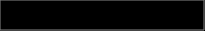
| Category | Series 0 |
|---|---|
| 0 | 0.21 |
| 1 | 0.553 |
| 2 | 0.253 |